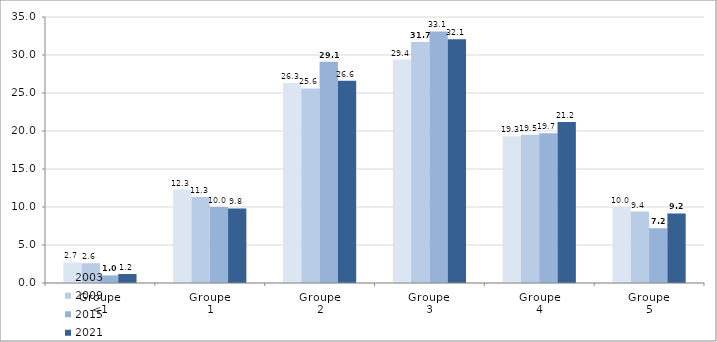
| Category | 2003 | 2009 | 2015 | 2021 |
|---|---|---|---|---|
| Groupe 
<1 | 2.7 | 2.6 | 1 | 1.188 |
| Groupe 
1 | 12.3 | 11.3 | 10 | 9.818 |
| Groupe 
2 | 26.3 | 25.6 | 29.1 | 26.61 |
| Groupe 
3 | 29.4 | 31.7 | 33.1 | 32.062 |
| Groupe
4 | 19.3 | 19.5 | 19.7 | 21.17 |
| Groupe 
5 | 10 | 9.4 | 7.2 | 9.152 |